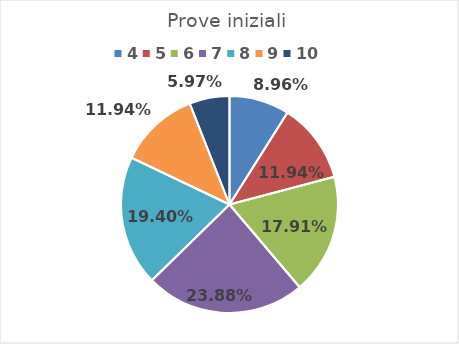
| Category | Series 0 |
|---|---|
| 4.0 | 0.09 |
| 5.0 | 0.119 |
| 6.0 | 0.179 |
| 7.0 | 0.239 |
| 8.0 | 0.194 |
| 9.0 | 0.119 |
| 10.0 | 0.06 |